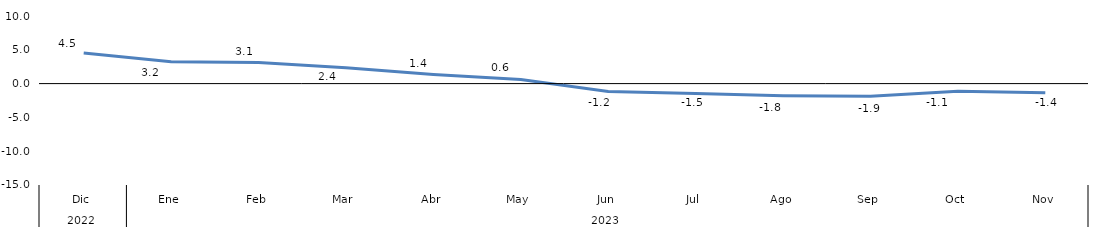
| Category | Bogotá |
|---|---|
| 0 | 4.529 |
| 1 | 3.225 |
| 2 | 3.113 |
| 3 | 2.357 |
| 4 | 1.355 |
| 5 | 0.603 |
| 6 | -1.173 |
| 7 | -1.465 |
| 8 | -1.794 |
| 9 | -1.869 |
| 10 | -1.125 |
| 11 | -1.361 |